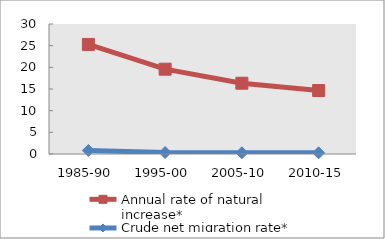
| Category | Annual rate of natural increase* | Crude net migration rate* |
|---|---|---|
| 1985-90 | 25.286 | 0.809 |
| 1995-00 | 19.573 | 0.344 |
| 2005-10 | 16.334 | 0.287 |
| 2010-15 | 14.648 | 0.265 |